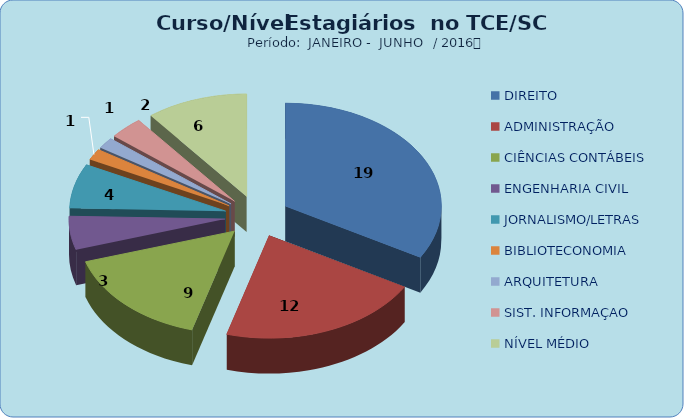
| Category | Series 0 |
|---|---|
| DIREITO | 19 |
| ADMINISTRAÇÃO | 12 |
| CIÊNCIAS CONTÁBEIS | 9 |
| ENGENHARIA CIVIL | 3 |
| JORNALISMO/LETRAS | 4 |
| BIBLIOTECONOMIA | 1 |
| ARQUITETURA | 1 |
| SIST. INFORMAÇAO | 2 |
| NÍVEL MÉDIO | 6 |